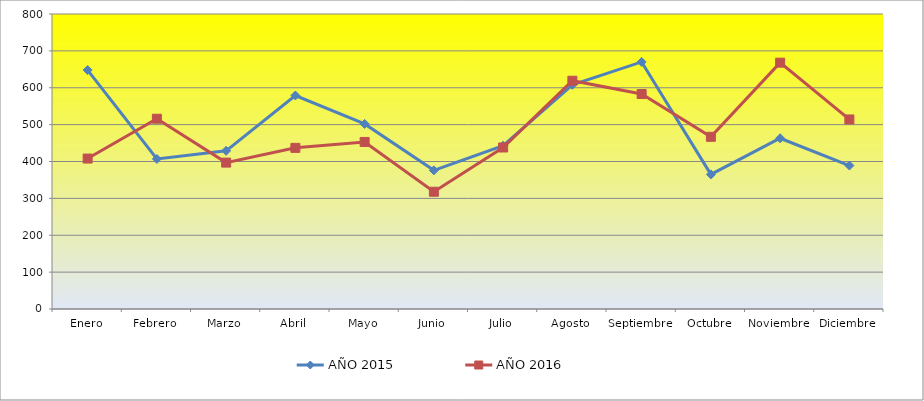
| Category | AÑO 2015 | AÑO 2016 |
|---|---|---|
| Enero | 648 | 408 |
| Febrero | 407 | 516 |
| Marzo | 429 | 397 |
| Abril | 579 | 437 |
| Mayo | 502 | 453 |
| Junio | 376 | 318 |
| Julio | 443 | 438 |
| Agosto | 608 | 619 |
| Septiembre | 670 | 583 |
| Octubre | 365 | 467 |
| Noviembre | 463 | 668 |
| Diciembre | 389 | 514 |